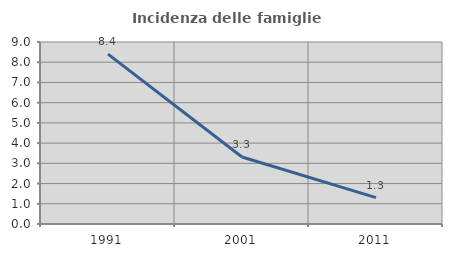
| Category | Incidenza delle famiglie numerose |
|---|---|
| 1991.0 | 8.403 |
| 2001.0 | 3.316 |
| 2011.0 | 1.306 |